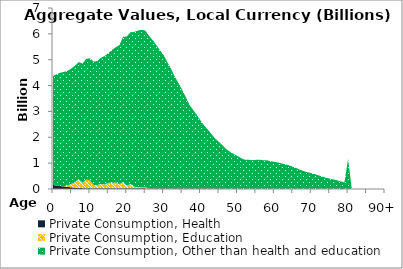
| Category | Private Consumption, Health | Private Consumption, Education | Private Consumption, Other than health and education |
|---|---|---|---|
| 0 | 156.683 | 0 | 4211.215 |
|  | 131.096 | 0 | 4310.314 |
| 2 | 115.374 | 2.072 | 4380.384 |
| 3 | 98.802 | 8.443 | 4423.144 |
| 4 | 81.74 | 56.765 | 4440.454 |
| 5 | 65.134 | 130.655 | 4464.294 |
| 6 | 51.78 | 218.378 | 4505.584 |
| 7 | 42.328 | 339.001 | 4529.69 |
| 8 | 33.7 | 208.703 | 4605.746 |
| 9 | 28.509 | 341.412 | 4665.144 |
| 10 | 28.846 | 308.186 | 4717.954 |
| 11 | 29.301 | 124.666 | 4773.206 |
| 12 | 27.973 | 124.247 | 4799.148 |
| 13 | 25.564 | 172.883 | 4877.686 |
| 14 | 25.361 | 147.053 | 4974.313 |
| 15 | 26.643 | 212.576 | 5016.663 |
| 16 | 26.655 | 216.606 | 5139.191 |
| 17 | 26.831 | 222.531 | 5235.239 |
| 18 | 27.727 | 153.445 | 5381.805 |
| 19 | 27.513 | 244.652 | 5614.53 |
| 20 | 27 | 102.457 | 5769.928 |
| 21 | 27.683 | 166.132 | 5870.44 |
| 22 | 27.638 | 65.338 | 5981.434 |
| 23 | 27.246 | 39.968 | 6061.122 |
| 24 | 25.275 | 37.064 | 6096.255 |
| 25 | 24.023 | 38.576 | 6064.702 |
| 26 | 23.02 | 8.412 | 5899.807 |
| 27 | 21.919 | 0 | 5737.32 |
| 28 | 20.757 | 0 | 5553.012 |
| 29 | 19.79 | 0 | 5348.764 |
| 30 | 19.05 | 0 | 5163.358 |
| 31 | 20.132 | 0 | 4881.972 |
| 32 | 19.575 | 0 | 4629.391 |
| 33 | 19.932 | 0 | 4330.99 |
| 34 | 20.578 | 0 | 4086.397 |
| 35 | 20.079 | 0 | 3821.272 |
| 36 | 19.736 | 0 | 3536.596 |
| 37 | 19.646 | 0 | 3232.018 |
| 38 | 19.766 | 0 | 3036.99 |
| 39 | 19.205 | 0 | 2839.702 |
| 40 | 18.498 | 0 | 2631.431 |
| 41 | 17.776 | 0 | 2432.841 |
| 42 | 18.698 | 0 | 2279.497 |
| 43 | 18.087 | 0 | 2097.391 |
| 44 | 16.875 | 0 | 1930.578 |
| 45 | 15.675 | 0 | 1804.41 |
| 46 | 13.616 | 0 | 1672.301 |
| 47 | 11.899 | 0 | 1524.993 |
| 48 | 14.046 | 0 | 1423.063 |
| 49 | 13.454 | 0 | 1342.134 |
| 50 | 12.562 | 0 | 1269.843 |
| 51 | 11.053 | 0 | 1181.914 |
| 52 | 10.435 | 0 | 1124.246 |
| 53 | 10.493 | 0 | 1121.31 |
| 54 | 9.984 | 0 | 1104.997 |
| 55 | 10.95 | 0 | 1115.432 |
| 56 | 12.04 | 0 | 1122.511 |
| 57 | 9.016 | 0 | 1102.348 |
| 58 | 10.357 | 0 | 1100.941 |
| 59 | 10.543 | 0 | 1065.735 |
| 60 | 9.486 | 0 | 1045.417 |
| 61 | 9.055 | 0 | 1016.472 |
| 62 | 10.202 | 0 | 979.006 |
| 63 | 10.294 | 0 | 942.721 |
| 64 | 10.055 | 0 | 905.561 |
| 65 | 10.32 | 0 | 849.679 |
| 66 | 9.767 | 0 | 796.265 |
| 67 | 8.102 | 0 | 734.731 |
| 68 | 9.113 | 0 | 685.31 |
| 69 | 9.445 | 0 | 637.993 |
| 70 | 9.038 | 0 | 607.892 |
| 71 | 7.782 | 0 | 564.327 |
| 72 | 7.42 | 0 | 520.579 |
| 73 | 6.731 | 0 | 473.846 |
| 74 | 5.629 | 0 | 428.795 |
| 75 | 5.125 | 0 | 399.278 |
| 76 | 6.147 | 0 | 365.308 |
| 77 | 5.497 | 0 | 329.775 |
| 78 | 4.825 | 0 | 292.196 |
| 79 | 4.155 | 0 | 254.043 |
| 80 | 18.517 | 0 | 1143.123 |
| 81 | 0 | 0 | 0 |
| 82 | 0 | 0 | 0 |
| 83 | 0 | 0 | 0 |
| 84 | 0 | 0 | 0 |
| 85 | 0 | 0 | 0 |
| 86 | 0 | 0 | 0 |
| 87 | 0 | 0 | 0 |
| 88 | 0 | 0 | 0 |
| 89 | 0 | 0 | 0 |
| 90+ | 0 | 0 | 0 |